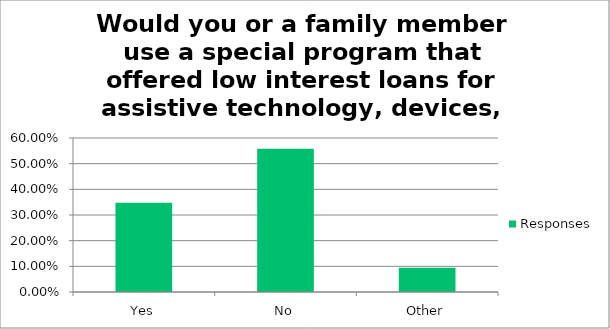
| Category | Responses |
|---|---|
| Yes | 0.347 |
| No | 0.558 |
| Other | 0.095 |